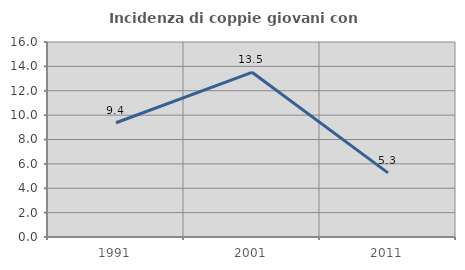
| Category | Incidenza di coppie giovani con figli |
|---|---|
| 1991.0 | 9.375 |
| 2001.0 | 13.514 |
| 2011.0 | 5.263 |